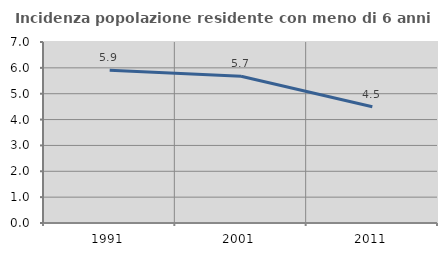
| Category | Incidenza popolazione residente con meno di 6 anni |
|---|---|
| 1991.0 | 5.91 |
| 2001.0 | 5.676 |
| 2011.0 | 4.493 |